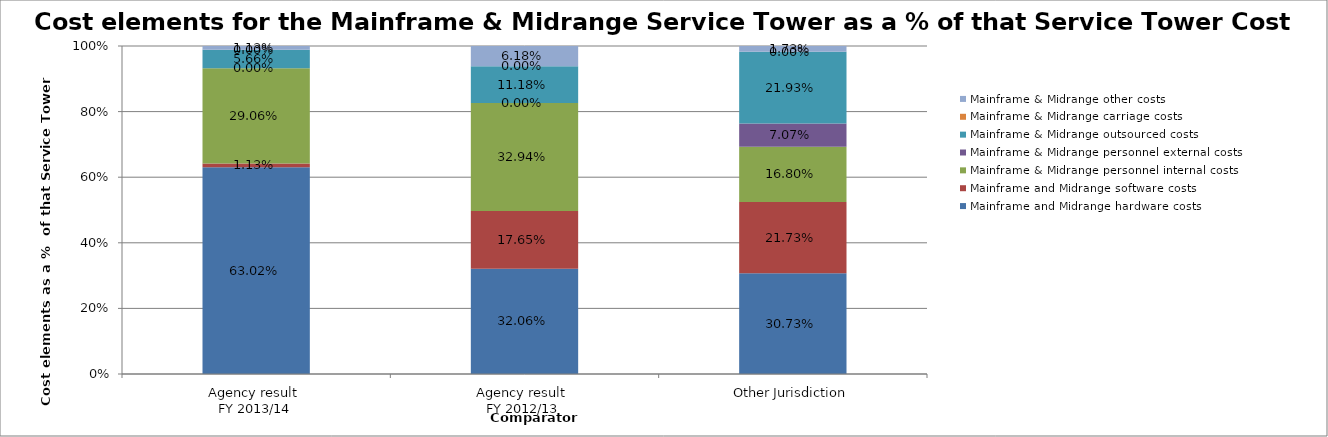
| Category | Mainframe and Midrange hardware costs | Mainframe and Midrange software costs | Mainframe & Midrange personnel internal costs | Mainframe & Midrange personnel external costs | Mainframe & Midrange outsourced costs | Mainframe & Midrange carriage costs | Mainframe & Midrange other costs |
|---|---|---|---|---|---|---|---|
| Agency result 
FY 2013/14 | 0.63 | 0.011 | 0.291 | 0 | 0.057 | 0 | 0.011 |
| Agency result 
FY 2012/13 | 0.321 | 0.176 | 0.329 | 0 | 0.112 | 0 | 0.062 |
| Other Jurisdiction | 0.307 | 0.217 | 0.168 | 0.071 | 0.219 | 0 | 0.017 |